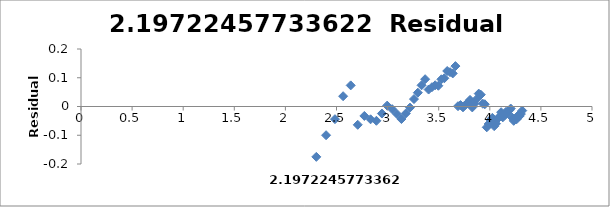
| Category | Series 0 |
|---|---|
| 2.302585092994046 | -0.175 |
| 2.3978952727983707 | -0.1 |
| 2.4849066497880004 | -0.044 |
| 2.5649493574615367 | 0.036 |
| 2.6390573296152584 | 0.073 |
| 2.70805020110221 | -0.064 |
| 2.772588722239781 | -0.033 |
| 2.833213344056216 | -0.045 |
| 2.8903717578961645 | -0.05 |
| 2.9444389791664403 | -0.024 |
| 2.995732273553991 | 0.003 |
| 3.044522437723423 | -0.009 |
| 3.091042453358316 | -0.026 |
| 3.1354942159291497 | -0.044 |
| 3.1780538303479458 | -0.024 |
| 3.2188758248682006 | -0.004 |
| 3.258096538021482 | 0.026 |
| 3.295836866004329 | 0.048 |
| 3.332204510175204 | 0.074 |
| 3.367295829986474 | 0.095 |
| 3.4011973816621555 | 0.059 |
| 3.4339872044851463 | 0.067 |
| 3.4657359027997265 | 0.074 |
| 3.4965075614664802 | 0.072 |
| 3.5263605246161616 | 0.095 |
| 3.5553480614894135 | 0.098 |
| 3.58351893845611 | 0.124 |
| 3.6109179126442243 | 0.119 |
| 3.6375861597263857 | 0.115 |
| 3.6635616461296463 | 0.141 |
| 3.6888794541139363 | 0.001 |
| 3.713572066704308 | 0.005 |
| 3.7376696182833684 | -0.003 |
| 3.7612001156935624 | 0.006 |
| 3.784189633918261 | 0.013 |
| 3.8066624897703196 | 0.023 |
| 3.828641396489095 | -0.003 |
| 3.8501476017100584 | 0.01 |
| 3.871201010907891 | 0.026 |
| 3.8918202981106265 | 0.045 |
| 3.912023005428146 | 0.041 |
| 3.9318256327243257 | 0.01 |
| 3.9512437185814275 | 0.008 |
| 3.970291913552122 | -0.072 |
| 3.9889840465642745 | -0.061 |
| 4.007333185232471 | -0.047 |
| 4.02535169073515 | -0.039 |
| 4.04305126783455 | -0.068 |
| 4.060443010546419 | -0.06 |
| 4.07753744390572 | -0.043 |
| 4.0943445622221 | -0.035 |
| 4.110873864173311 | -0.02 |
| 4.127134385045092 | -0.038 |
| 4.143134726391533 | -0.031 |
| 4.1588830833596715 | -0.018 |
| 4.174387269895637 | -0.023 |
| 4.189654742026425 | -0.014 |
| 4.204692619390966 | -0.007 |
| 4.219507705176107 | -0.039 |
| 4.23410650459726 | -0.05 |
| 4.248495242049359 | -0.043 |
| 4.2626798770413155 | -0.044 |
| 4.276666119016055 | -0.031 |
| 4.290459441148391 | -0.034 |
| 4.30406509320417 | -0.026 |
| 4.31748811353631 | -0.014 |